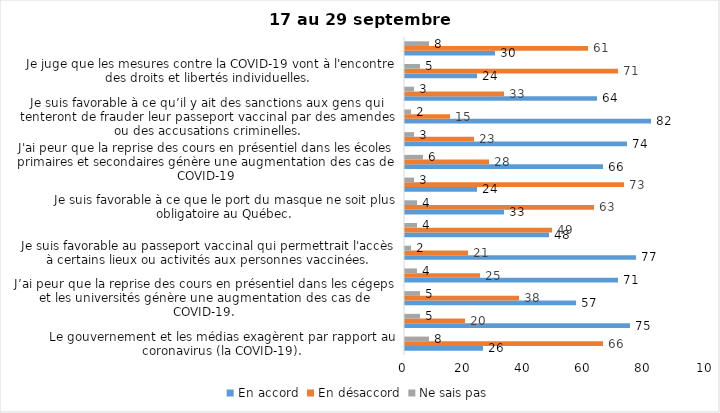
| Category | En accord | En désaccord | Ne sais pas |
|---|---|---|---|
| Le gouvernement et les médias exagèrent par rapport au coronavirus (la COVID-19). | 26 | 66 | 8 |
| J’ai peur que le système de santé soit débordé par les cas de COVID-19. | 75 | 20 | 5 |
| J’ai peur que la reprise des cours en présentiel dans les cégeps et les universités génère une augmentation des cas de COVID-19. | 57 | 38 | 5 |
| Je suis inquiet/inquiète  que le nombre de cas augmente en raison des nouveaux variants du virus de la COVID-19 | 71 | 25 | 4 |
| Je suis favorable au passeport vaccinal qui permettrait l'accès à certains lieux ou activités aux personnes vaccinées. | 77 | 21 | 2 |
| Si les cas de COVID-19 augmentent cet automne, je suis favorable à la mise en place de mesures de confinement (ex. fermeture de services non essentiels, interdiction des rassemblements privés) | 48 | 49 | 4 |
| Je suis favorable à ce que le port du masque ne soit plus obligatoire au Québec. | 33 | 63 | 4 |
| Étant donné la progression de la vaccination, je pense qu’il est moins important de suivre les mesures de prévention. | 24 | 73 | 3 |
| J'ai peur que la reprise des cours en présentiel dans les écoles primaires et secondaires génère une augmentation des cas de COVID-19 | 66 | 28 | 6 |
| Je suis favorable à ce qu’il y ait des sanctions aux commerçants qui ne vérifieront pas le passeport vaccinal (code QR) de leurs clients | 74 | 23 | 3 |
| Je suis favorable à ce qu’il y ait des sanctions aux gens qui tenteront de frauder leur passeport vaccinal par des amendes ou des accusations criminelles. | 82 | 15 | 2 |
| Je crois que le passeport vaccinal devrait être requis pour davantage de services et commerces (ex. : spas, centre d’achats, centre de soins personnels. | 64 | 33 | 3 |
| Je juge que les mesures contre la COVID-19 vont à l'encontre des droits et libertés individuelles.  | 24 | 71 | 5 |
| Je pense que le gouvernement du Québec devrait mettre fin à l’état d’urgence sanitaire.  | 30 | 61 | 8 |